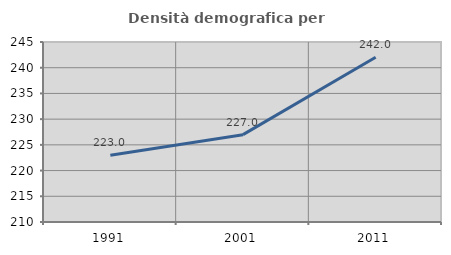
| Category | Densità demografica |
|---|---|
| 1991.0 | 222.979 |
| 2001.0 | 226.983 |
| 2011.0 | 242.05 |